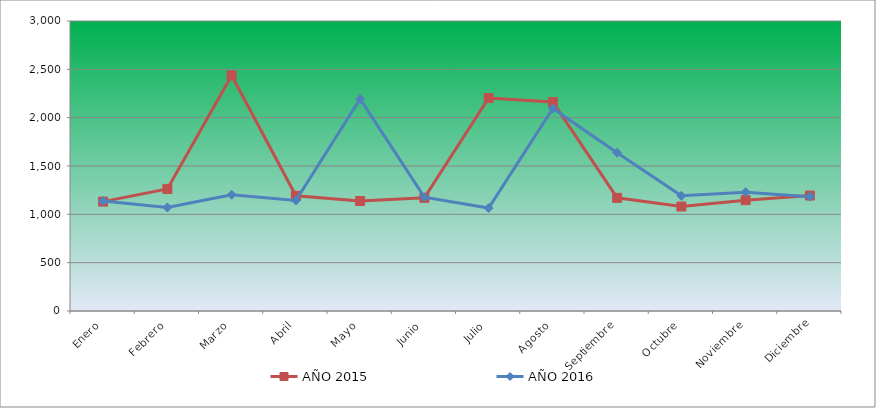
| Category | AÑO 2015 | AÑO 2016 |
|---|---|---|
| Enero | 1131.543 | 1137.06 |
| Febrero | 1263.257 | 1070.851 |
| Marzo | 2436.709 | 1203.268 |
| Abril | 1191.413 | 1142.817 |
| Mayo | 1137.53 | 2193.518 |
| Junio | 1170.458 | 1177.361 |
| Julio | 2203.216 | 1065.094 |
| Agosto | 2161.307 | 2095.644 |
| Septiembre | 1170.458 | 1637.942 |
| Octubre | 1080.653 | 1191.754 |
| Noviembre | 1146.51 | 1229.176 |
| Diciembre | 1194.406 | 1183.118 |